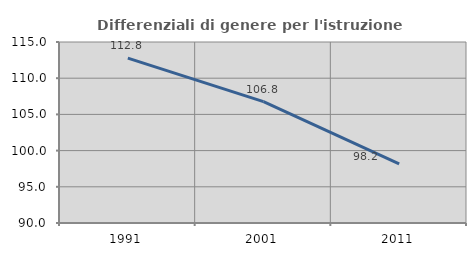
| Category | Differenziali di genere per l'istruzione superiore |
|---|---|
| 1991.0 | 112.774 |
| 2001.0 | 106.758 |
| 2011.0 | 98.167 |